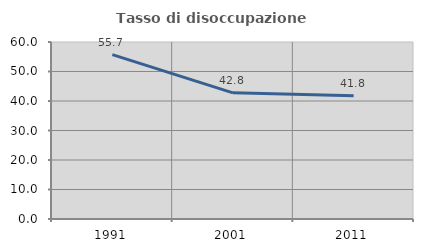
| Category | Tasso di disoccupazione giovanile  |
|---|---|
| 1991.0 | 55.74 |
| 2001.0 | 42.766 |
| 2011.0 | 41.779 |